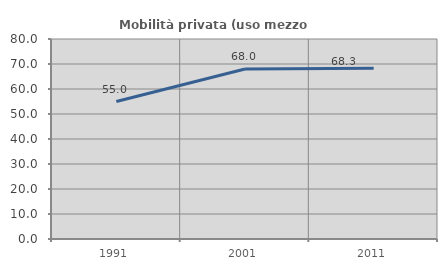
| Category | Mobilità privata (uso mezzo privato) |
|---|---|
| 1991.0 | 54.979 |
| 2001.0 | 68.015 |
| 2011.0 | 68.338 |